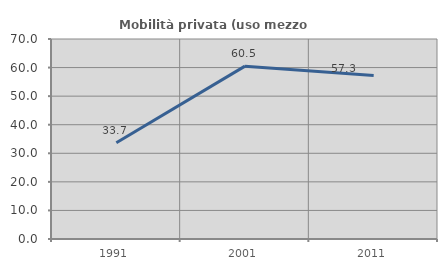
| Category | Mobilità privata (uso mezzo privato) |
|---|---|
| 1991.0 | 33.708 |
| 2001.0 | 60.494 |
| 2011.0 | 57.252 |